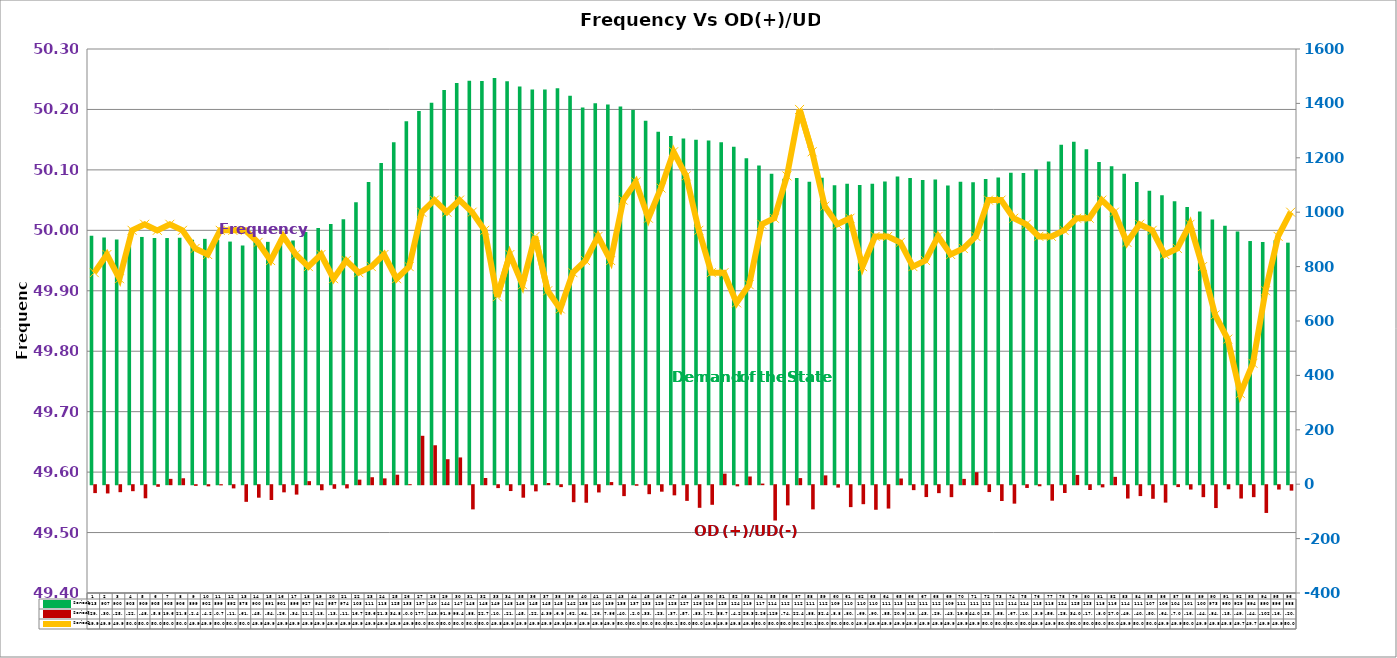
| Category | Series 2 | Series 4 |
|---|---|---|
| 0 | 913 | -29.023 |
| 1 | 907 | -30.292 |
| 2 | 900 | -25.649 |
| 3 | 903 | -22.013 |
| 4 | 909 | -48.078 |
| 5 | 905 | -5.865 |
| 6 | 905 | 19.655 |
| 7 | 906 | 21.833 |
| 8 | 899 | -2.449 |
| 9 | 902 | -4.269 |
| 10 | 899 | -0.722 |
| 11 | 892 | -11.732 |
| 12 | 878 | -61.166 |
| 13 | 900 | -45.926 |
| 14 | 891 | -54.349 |
| 15 | 901 | -26.259 |
| 16 | 896 | -34.558 |
| 17 | 927 | 11.242 |
| 18 | 942 | -18.639 |
| 19 | 957 | -13.209 |
| 20 | 974 | -11.716 |
| 21 | 1037 | 16.766 |
| 22 | 1111 | 25.646 |
| 23 | 1181 | 21.387 |
| 24 | 1257 | 34.856 |
| 25 | 1334 | -0.005 |
| 26 | 1372 | 177.977 |
| 27 | 1402 | 143.146 |
| 28 | 1449 | 91.919 |
| 29 | 1475 | 98.402 |
| 30 | 1483 | -88.87 |
| 31 | 1482 | 22.725 |
| 32 | 1493 | -10.685 |
| 33 | 1481 | -21.494 |
| 34 | 1462 | -45.895 |
| 35 | 1451 | -22.721 |
| 36 | 1451 | 4.395 |
| 37 | 1456 | -6.994 |
| 38 | 1428 | -62.442 |
| 39 | 1385 | -64.429 |
| 40 | 1401 | -26.69 |
| 41 | 1396 | 7.86 |
| 42 | 1389 | -40.17 |
| 43 | 1376 | -2.08 |
| 44 | 1336 | -33.02 |
| 45 | 1296 | -23.86 |
| 46 | 1280 | -37.27 |
| 47 | 1271 | -57.63 |
| 48 | 1266 | -83.153 |
| 49 | 1264 | -72.053 |
| 50 | 1257 | 38.757 |
| 51 | 1241 | -4.213 |
| 52 | 1198 | 28.334 |
| 53 | 1172 | 2.264 |
| 54 | 1141 | -129.803 |
| 55 | 1123 | -74.27 |
| 56 | 1126 | 22.43 |
| 57 | 1112 | -88.85 |
| 58 | 1127 | 32.459 |
| 59 | 1099 | -8.875 |
| 60 | 1105 | -80.58 |
| 61 | 1100 | -69.831 |
| 62 | 1105 | -90.345 |
| 63 | 1113 | -85.865 |
| 64 | 1131 | 20.947 |
| 65 | 1126 | -18.153 |
| 66 | 1118 | -43.613 |
| 67 | 1120 | -29.224 |
| 68 | 1098 | -43.94 |
| 69 | 1112 | 19.51 |
| 70 | 1110 | 44.092 |
| 71 | 1122 | -25.242 |
| 72 | 1128 | -58.152 |
| 73 | 1145 | -67.79 |
| 74 | 1144 | -10.141 |
| 75 | 1157 | -3.989 |
| 76 | 1186 | -56.994 |
| 77 | 1248 | -28.582 |
| 78 | 1259 | 34.067 |
| 79 | 1231 | -17.713 |
| 80 | 1185 | -8 |
| 81 | 1169 | 27 |
| 82 | 1141 | -49 |
| 83 | 1111 | -40 |
| 84 | 1079 | -50 |
| 85 | 1062 | -64 |
| 86 | 1040 | -7 |
| 87 | 1019 | -16 |
| 88 | 1003 | -44 |
| 89 | 973 | -84 |
| 90 | 950 | -15 |
| 91 | 929 | -49 |
| 92 | 894 | -44 |
| 93 | 890 | -102 |
| 94 | 896 | -16 |
| 95 | 888 | -20 |